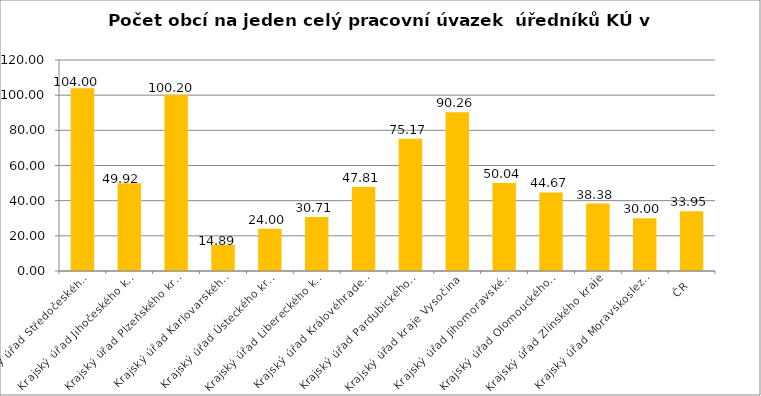
| Category | Počet obcí na jeden celý pracovní úvazek  úředníků KÚ |
|---|---|
| Krajský úřad Středočeského kraje | 104 |
| Krajský úřad Jihočeského kraje | 49.92 |
| Krajský úřad Plzeňského kraje | 100.2 |
| Krajský úřad Karlovarského kraje | 14.89 |
| Krajský úřad Ústeckého kraje | 24 |
| Krajský úřad Libereckého kraje | 30.71 |
| Krajský úřad Královéhradeckého kraje | 47.81 |
| Krajský úřad Pardubického kraje | 75.17 |
| Krajský úřad kraje Vysočina | 90.26 |
| Krajský úřad Jihomoravského kraje | 50.04 |
| Krajský úřad Olomouckého kraje | 44.67 |
| Krajský úřad Zlínského kraje | 38.38 |
| Krajský úřad Moravskoslezského kraje | 30 |
| ČR | 33.95 |